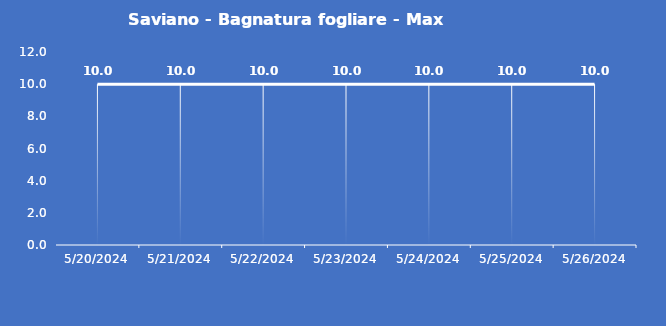
| Category | Saviano - Bagnatura fogliare - Max (min) |
|---|---|
| 5/20/24 | 10 |
| 5/21/24 | 10 |
| 5/22/24 | 10 |
| 5/23/24 | 10 |
| 5/24/24 | 10 |
| 5/25/24 | 10 |
| 5/26/24 | 10 |